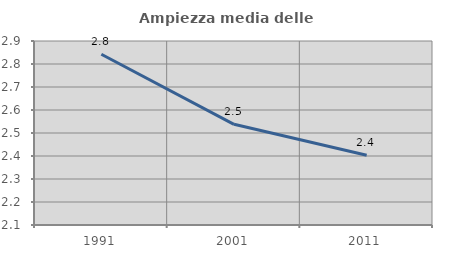
| Category | Ampiezza media delle famiglie |
|---|---|
| 1991.0 | 2.843 |
| 2001.0 | 2.538 |
| 2011.0 | 2.403 |